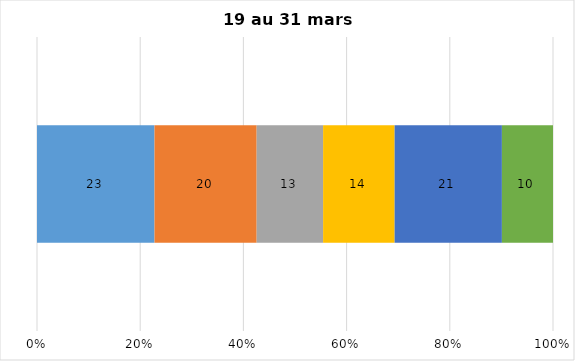
| Category | Plusieurs fois par jour | Une fois par jour | Quelques fois par semaine   | Une fois par semaine ou moins   |  Jamais   |  Je n’utilise pas les médias sociaux |
|---|---|---|---|---|---|---|
| 0 | 23 | 20 | 13 | 14 | 21 | 10 |